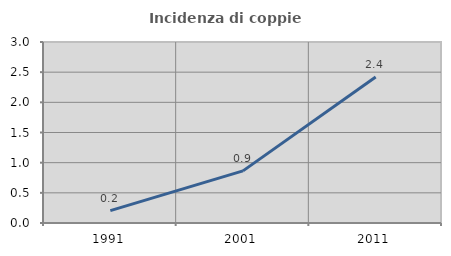
| Category | Incidenza di coppie miste |
|---|---|
| 1991.0 | 0.206 |
| 2001.0 | 0.864 |
| 2011.0 | 2.421 |